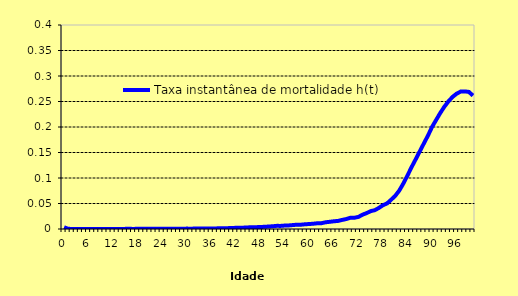
| Category | Taxa instantânea de mortalidade h(t) |
|---|---|
| 0.0 | 0.003 |
| 1.0 | 0 |
| 2.0 | 0 |
| 3.0 | 0 |
| 4.0 | 0 |
| 5.0 | 0 |
| 6.0 | 0 |
| 7.0 | 0 |
| 8.0 | 0 |
| 9.0 | 0 |
| 10.0 | 0 |
| 11.0 | 0 |
| 12.0 | 0 |
| 13.0 | 0 |
| 14.0 | 0 |
| 15.0 | 0 |
| 16.0 | 0 |
| 17.0 | 0 |
| 18.0 | 0 |
| 19.0 | 0 |
| 20.0 | 0 |
| 21.0 | 0.001 |
| 22.0 | 0.001 |
| 23.0 | 0.001 |
| 24.0 | 0.001 |
| 25.0 | 0.001 |
| 26.0 | 0.001 |
| 27.0 | 0.001 |
| 28.0 | 0.001 |
| 29.0 | 0.001 |
| 30.0 | 0.001 |
| 31.0 | 0.001 |
| 32.0 | 0.001 |
| 33.0 | 0.001 |
| 34.0 | 0.001 |
| 35.0 | 0.001 |
| 36.0 | 0.001 |
| 37.0 | 0.001 |
| 38.0 | 0.001 |
| 39.0 | 0.002 |
| 40.0 | 0.002 |
| 41.0 | 0.002 |
| 42.0 | 0.002 |
| 43.0 | 0.002 |
| 44.0 | 0.003 |
| 45.0 | 0.003 |
| 46.0 | 0.003 |
| 47.0 | 0.004 |
| 48.0 | 0.004 |
| 49.0 | 0.004 |
| 50.0 | 0.005 |
| 51.0 | 0.005 |
| 52.0 | 0.006 |
| 53.0 | 0.006 |
| 54.0 | 0.007 |
| 55.0 | 0.007 |
| 56.0 | 0.008 |
| 57.0 | 0.008 |
| 58.0 | 0.008 |
| 59.0 | 0.009 |
| 60.0 | 0.01 |
| 61.0 | 0.01 |
| 62.0 | 0.011 |
| 63.0 | 0.011 |
| 64.0 | 0.013 |
| 65.0 | 0.014 |
| 66.0 | 0.015 |
| 67.0 | 0.016 |
| 68.0 | 0.018 |
| 69.0 | 0.019 |
| 70.0 | 0.022 |
| 71.0 | 0.022 |
| 72.0 | 0.024 |
| 73.0 | 0.028 |
| 74.0 | 0.031 |
| 75.0 | 0.035 |
| 76.0 | 0.037 |
| 77.0 | 0.041 |
| 78.0 | 0.047 |
| 79.0 | 0.05 |
| 80.0 | 0.057 |
| 81.0 | 0.065 |
| 82.0 | 0.076 |
| 83.0 | 0.09 |
| 84.0 | 0.105 |
| 85.0 | 0.121 |
| 86.0 | 0.137 |
| 87.0 | 0.152 |
| 88.0 | 0.168 |
| 89.0 | 0.183 |
| 90.0 | 0.2 |
| 91.0 | 0.214 |
| 92.0 | 0.227 |
| 93.0 | 0.24 |
| 94.0 | 0.25 |
| 95.0 | 0.259 |
| 96.0 | 0.265 |
| 97.0 | 0.269 |
| 98.0 | 0.27 |
| 99.0 | 0.269 |
| 100.0 | 0.262 |